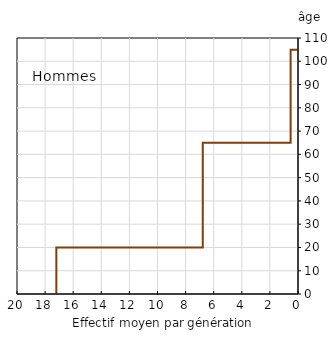
| Category | Hommes |
|---|---|
| -17.2 | 0 |
| -17.2 | 20 |
| -6.777777777777778 | 20 |
| -6.777777777777778 | 65 |
| -0.525 | 65 |
| -0.525 | 105 |
| 0.0 | 105 |